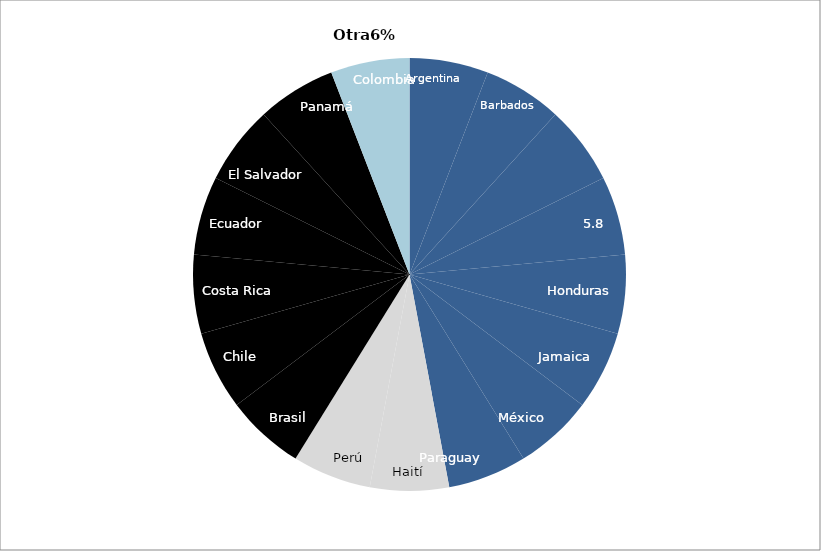
| Category | Series 0 |
|---|---|
| Argentina | 1 |
| Barbados | 1 |
| Dominican Republic  | 1 |
| 5.8 | 1 |
| Honduras | 1 |
| Jamainca | 1 |
| Mexico | 1 |
| Paraguay | 1 |
| Haiti | 1 |
| Peru | 1 |
| Brazil | 1 |
| Chile | 1 |
| Costa Rica | 1 |
| Ecuador | 1 |
| El Salvador | 1 |
| Panama | 1 |
| Colombia | 1 |